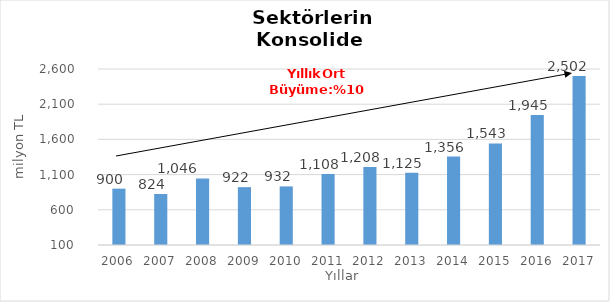
| Category | Toplam |
|---|---|
| 2006.0 | 900.249 |
| 2007.0 | 824.279 |
| 2008.0 | 1046.34 |
| 2009.0 | 921.592 |
| 2010.0 | 931.985 |
| 2011.0 | 1107.741 |
| 2012.0 | 1207.621 |
| 2013.0 | 1125.414 |
| 2014.0 | 1355.909 |
| 2015.0 | 1543 |
| 2016.0 | 1945 |
| 2017.0 | 2502 |